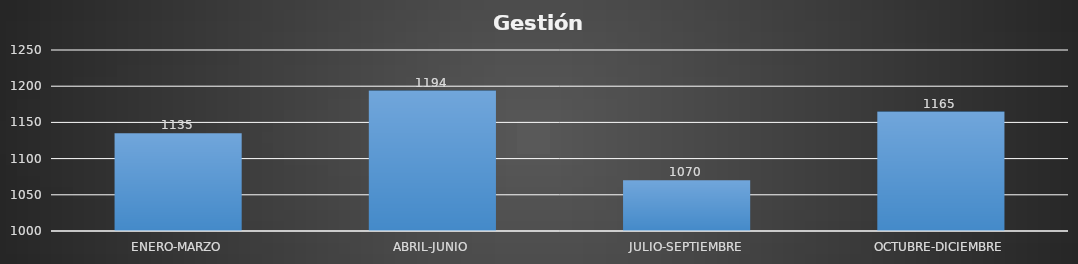
| Category | Series 0 |
|---|---|
| ENERO-MARZO | 1135 |
| ABRIL-JUNIO | 1194 |
| JULIO-SEPTIEMBRE | 1070 |
| OCTUBRE-DICIEMBRE | 1165 |